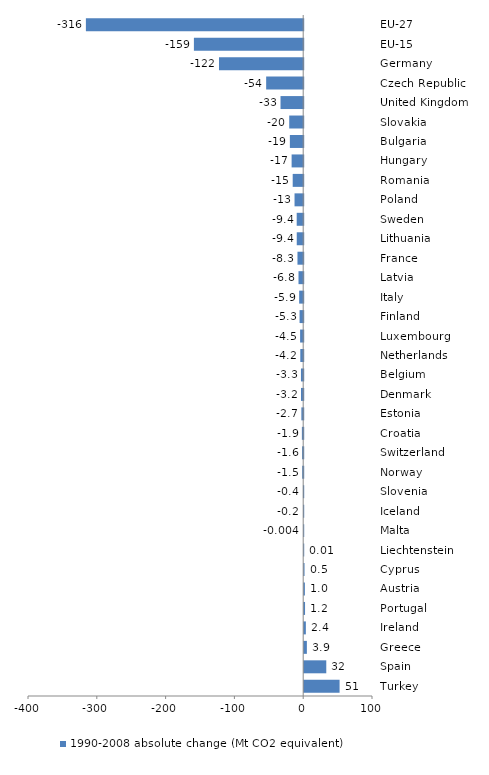
| Category | 1990-2008 absolute change (Mt CO2 equivalent) |
|---|---|
| EU-27 | -315.859 |
| EU-15 | -158.862 |
| Germany | -122.394 |
| Czech Republic | -53.833 |
| United Kingdom | -32.967 |
| Slovakia | -20.318 |
| Bulgaria | -19.376 |
| Hungary | -16.842 |
| Romania | -15.265 |
| Poland | -12.596 |
| Sweden | -9.446 |
| Lithuania | -9.378 |
| France | -8.327 |
| Latvia | -6.834 |
| Italy | -5.865 |
| Finland | -5.286 |
| Luxembourg | -4.501 |
| Netherlands | -4.214 |
| Belgium | -3.268 |
| Denmark | -3.223 |
| Estonia | -2.66 |
| Croatia | -1.922 |
| Switzerland | -1.643 |
| Norway | -1.497 |
| Slovenia | -0.36 |
| Iceland | -0.164 |
| Malta | -0.004 |
| Liechtenstein | 0.011 |
| Cyprus | 0.468 |
| Austria | 1.004 |
| Portugal | 1.227 |
| Ireland | 2.407 |
| Greece | 3.898 |
| Spain | 32.094 |
| Turkey | 51.424 |